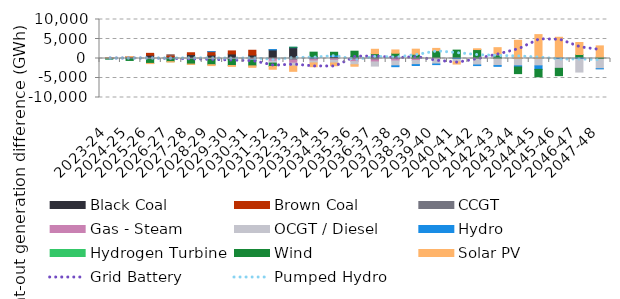
| Category | Black Coal | Brown Coal | CCGT | Gas - Steam | OCGT / Diesel | Hydro | Hydrogen Turbine | Wind | Solar PV |
|---|---|---|---|---|---|---|---|---|---|
| 2023-24 | -7.392 | 152.6 | 1.248 | -1.878 | -0.27 | -44.019 | 0 | -95.47 | 3.188 |
| 2024-25 | 314.727 | 121.871 | 10.974 | -4.759 | -3.243 | -47.029 | 0 | -446.687 | 45.826 |
| 2025-26 | 848.246 | 471.592 | -15.55 | -63.426 | -60.055 | -22.895 | 0 | -1098.237 | -46.131 |
| 2026-27 | 486.595 | 409.852 | 0.852 | -47.359 | -39.507 | -28.147 | 0 | -691.889 | -89.185 |
| 2027-28 | 1008.901 | 465.314 | -42.512 | -54.627 | -45.558 | -39.248 | 0 | -1252.218 | -79.631 |
| 2028-29 | 877.32 | 876.965 | -18.335 | -90.07 | -127.276 | 1.355 | 0 | -1352.409 | -230.733 |
| 2029-30 | 1166.217 | 778.305 | -56.096 | -81.734 | -69.941 | -33.122 | 0 | -1560.449 | -224.28 |
| 2030-31 | 898.943 | 1213.959 | -102.288 | -185.18 | -138.771 | -43.9 | 0 | -1416.749 | -371.911 |
| 2031-32 | 2216.374 | -0.292 | -43.287 | -659.058 | -483.677 | 58.999 | 0 | -848.431 | -719.607 |
| 2032-33 | 2778.937 | -0.301 | -411.473 | -786.402 | -736.336 | 86.968 | 0 | 18.1 | -1355.816 |
| 2033-34 | 149.109 | -0.23 | -214.196 | -405.466 | -512.387 | 331.723 | 0 | 1145.687 | -972.054 |
| 2034-35 | 506.839 | -0.238 | -76.403 | -388.169 | -693.134 | 375.157 | 0 | 716.951 | -701.927 |
| 2035-36 | 373.127 | -0.226 | -307.614 | -483.485 | -809.281 | 80.962 | 0 | 1419.369 | -385.927 |
| 2036-37 | 442.137 | -0.058 | -350.698 | -529.219 | -1067.689 | 28.924 | 0 | 765.056 | 1127.737 |
| 2037-38 | 433.732 | -0.062 | -169.56 | -458.26 | -1250.289 | -220.32 | 0 | 917.217 | 843.397 |
| 2038-39 | 114.648 | -0.033 | -34.786 | -475.031 | -1063.227 | -224.21 | 0 | 972.819 | 1304.005 |
| 2039-40 | 226.474 | -0.03 | 73.155 | 0 | -1417.791 | -147.363 | 0 | 1700.803 | 589.575 |
| 2040-41 | 0.035 | -0.025 | -19.587 | 0 | -846.924 | 301.342 | 0 | 1849.264 | -560.814 |
| 2041-42 | 0.026 | -0.026 | 94.414 | 0 | -1667.097 | -148.495 | 0 | 2198.985 | 202.361 |
| 2042-43 | 0.023 | -0.026 | 112.622 | 0 | -1810.712 | -203.297 | 0 | 832.889 | 1835.276 |
| 2043-44 | 0.023 | -0.027 | -56.934 | 0 | -1822.587 | -303.882 | 0 | -1692.818 | 4661.01 |
| 2044-45 | 0 | -0.024 | 36.291 | 0 | -1885.917 | -901.312 | 0 | -1901.944 | 6088.503 |
| 2045-46 | -0.001 | -0.004 | -12.509 | 0 | -2507.414 | 323.425 | 0 | -1879.323 | 5118.4 |
| 2046-47 | 0 | -0.006 | -3.671 | 0 | -3471.771 | 332.924 | 0 | 690.09 | 3081.306 |
| 2047-48 | 0 | 0 | 1.924 | 0 | -2619.05 | -29.42 | 0 | 349.942 | 2883.044 |